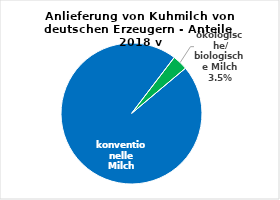
| Category | Series 0 |
|---|---|
| konventionelle Milch | 0.965 |
| ökologische/ biologische Milch | 0.035 |